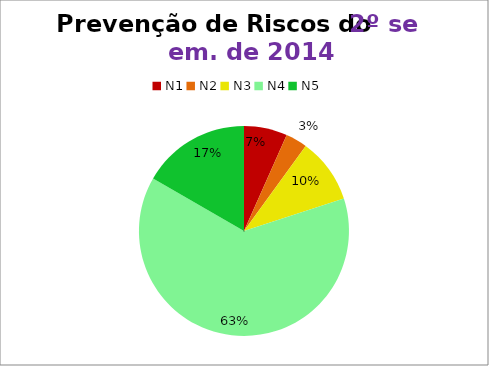
| Category | 2º/14 |
|---|---|
| N1 | 2 |
| N2 | 1 |
| N3 | 3 |
| N4 | 19 |
| N5 | 5 |